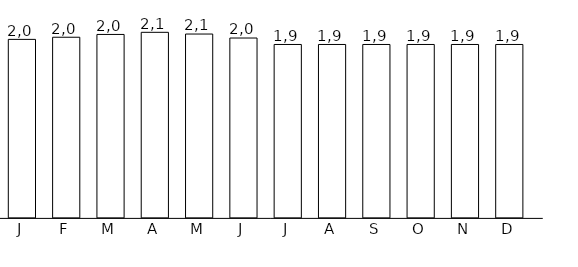
| Category | column_BUD | Series 1 |
|---|---|---|
| 0 | 823.47 |  |
| 1 | 833.302 |  |
| 2 | 846.117 |  |
| 3 | 855.95 |  |
| 4 | 848.029 |  |
| 5 | 829.666 |  |
| 6 | 800 |  |
| 7 | 799.998 |  |
| 8 | 799.998 |  |
| 9 | 800 |  |
| 10 | 799.998 |  |
| 11 | 799.997 |  |